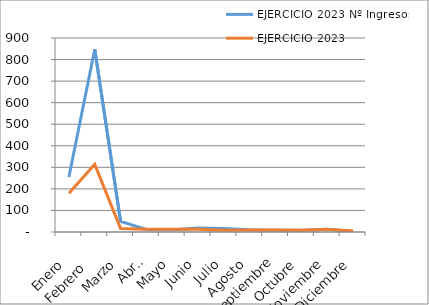
| Category | EJERCICIO 2023 |
|---|---|
| Enero | 180 |
| Febrero  | 314 |
| Marzo | 16 |
| Abril | 13 |
| Mayo | 13 |
| Junio | 13 |
| Julio | 8 |
| Agosto | 9 |
| Septiembre | 9 |
| Octubre | 8 |
| Noviembre | 13 |
| Diciembre | 5 |